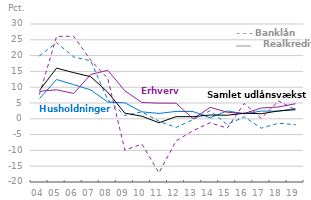
| Category | Husholdninger Realkredit | Husholdninger Banklån | Erhverv Realkredit | Erhverv Banklån | Samlet |
|---|---|---|---|---|---|
| 04 | 6.41 | 19.952 | 8.718 | 7.782 | 9.016 |
| 05 | 12.433 | 24.105 | 9.183 | 26.085 | 16.031 |
| 06 | 10.825 | 19.576 | 8.02 | 26.119 | 14.612 |
| 07 | 9.129 | 18.345 | 14.02 | 18.554 | 13.319 |
| 08 | 5.304 | 5.949 | 15.342 | 12.761 | 8.407 |
| 09 | 5.058 | 1.039 | 8.867 | -9.904 | 1.778 |
| 10 | 2.196 | 2.192 | 5.151 | -8.006 | 0.817 |
| 11 | 1.702 | -0.758 | 4.965 | -17.101 | -1.249 |
| 12 | 2.331 | -2.742 | 4.936 | -7.007 | 0.675 |
| 13 | 2.284 | -0.24 | -0.006 | -3.742 | 0.674 |
| 14 | 0.326 | 2.572 | 3.628 | -1.233 | 1.196 |
| 15 | 2.496 | -1.802 | 2.063 | -2.955 | 1.127 |
| 16 | 1.56 | 0.606 | 1.683 | 4.851 | 1.779 |
| 17 | 2.459 | -2.968 | 3.408 | 0.117 | 1.605 |
| 18 | 2.381 | -1.403 | 3.744 | 5.679 | 2.49 |
| 19 | 3.269 | -1.861 | 4.768 | 2.816 | 2.871 |